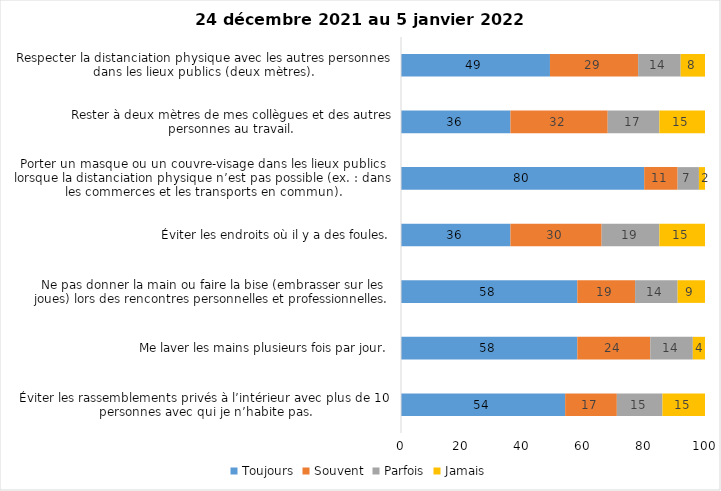
| Category | Toujours | Souvent | Parfois | Jamais |
|---|---|---|---|---|
| Éviter les rassemblements privés à l’intérieur avec plus de 10 personnes avec qui je n’habite pas. | 54 | 17 | 15 | 15 |
| Me laver les mains plusieurs fois par jour. | 58 | 24 | 14 | 4 |
| Ne pas donner la main ou faire la bise (embrasser sur les joues) lors des rencontres personnelles et professionnelles. | 58 | 19 | 14 | 9 |
| Éviter les endroits où il y a des foules. | 36 | 30 | 19 | 15 |
| Porter un masque ou un couvre-visage dans les lieux publics lorsque la distanciation physique n’est pas possible (ex. : dans les commerces et les transports en commun). | 80 | 11 | 7 | 2 |
| Rester à deux mètres de mes collègues et des autres personnes au travail. | 36 | 32 | 17 | 15 |
| Respecter la distanciation physique avec les autres personnes dans les lieux publics (deux mètres). | 49 | 29 | 14 | 8 |